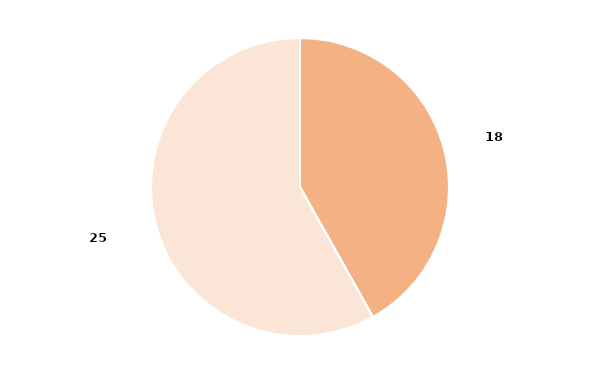
| Category | Series 0 |
|---|---|
| Criterio de Oportunidad | 0.419 |
| Conciliación | 0 |
| Suspensión Condicional del Procedimiento | 0.581 |